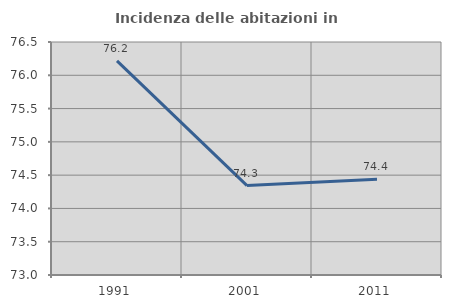
| Category | Incidenza delle abitazioni in proprietà  |
|---|---|
| 1991.0 | 76.216 |
| 2001.0 | 74.343 |
| 2011.0 | 74.437 |